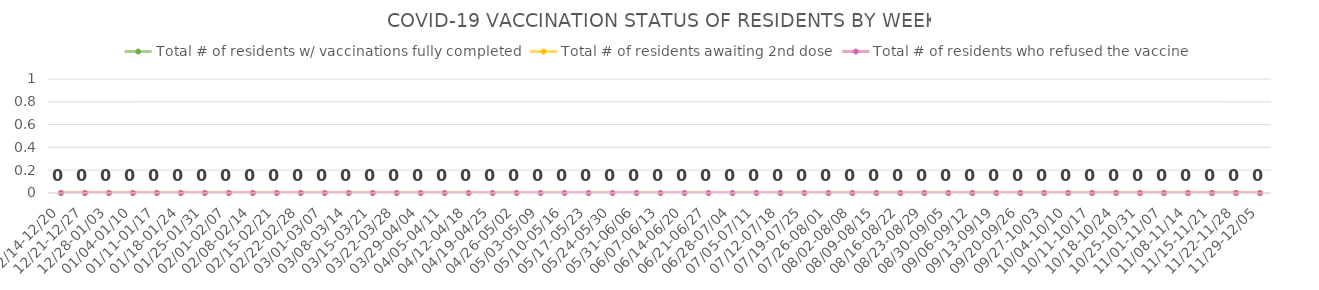
| Category | Total # of residents w/ vaccinations fully completed | Total # of residents awaiting 2nd dose | Total # of residents who refused the vaccine |
|---|---|---|---|
| 12/14-12/20 | 0 | 0 | 0 |
| 12/21-12/27 | 0 | 0 | 0 |
| 12/28-01/03 | 0 | 0 | 0 |
| 01/04-01/10 | 0 | 0 | 0 |
| 01/11-01/17 | 0 | 0 | 0 |
| 01/18-01/24 | 0 | 0 | 0 |
| 01/25-01/31 | 0 | 0 | 0 |
| 02/01-02/07 | 0 | 0 | 0 |
| 02/08-02/14 | 0 | 0 | 0 |
| 02/15-02/21 | 0 | 0 | 0 |
| 02/22-02/28 | 0 | 0 | 0 |
| 03/01-03/07 | 0 | 0 | 0 |
| 03/08-03/14 | 0 | 0 | 0 |
| 03/15-03/21 | 0 | 0 | 0 |
| 03/22-03/28 | 0 | 0 | 0 |
| 03/29-04/04 | 0 | 0 | 0 |
| 04/05-04/11 | 0 | 0 | 0 |
| 04/12-04/18 | 0 | 0 | 0 |
| 04/19-04/25 | 0 | 0 | 0 |
| 04/26-05/02 | 0 | 0 | 0 |
| 05/03-05/09 | 0 | 0 | 0 |
| 05/10-05/16 | 0 | 0 | 0 |
| 05/17-05/23 | 0 | 0 | 0 |
| 05/24-05/30 | 0 | 0 | 0 |
| 05/31-06/06 | 0 | 0 | 0 |